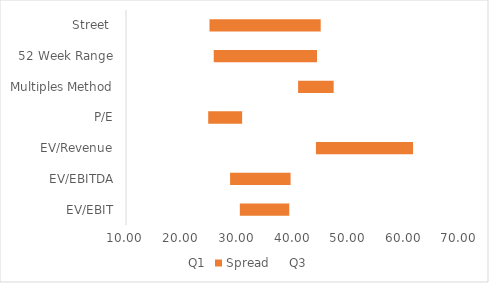
| Category | Q1 | Spread | Q3 |
|---|---|---|---|
| EV/EBIT | 30.449 | 8.921 | 39.37 |
| EV/EBITDA | 28.695 | 10.903 | 39.598 |
| EV/Revenue | 44.123 | 17.465 | 61.588 |
| P/E | 24.768 | 6.135 | 30.903 |
| Multiples Method | 40.917 | 6.414 | 47.33 |
| 52 Week Range | 25.76 | 18.56 | 44.32 |
| Street  | 25 | 20 | 45 |